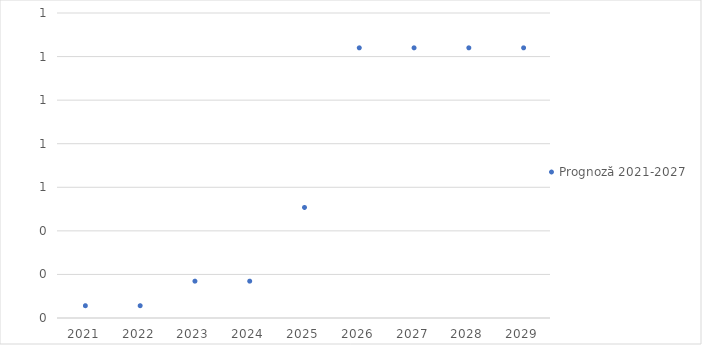
| Category | Prognoză 2021-2027 |
|---|---|
| 2021.0 | 0.056 |
| 2022.0 | 0.056 |
| 2023.0 | 0.169 |
| 2024.0 | 0.169 |
| 2025.0 | 0.507 |
| 2026.0 | 1.24 |
| 2027.0 | 1.24 |
| 2028.0 | 1.24 |
| 2029.0 | 1.24 |